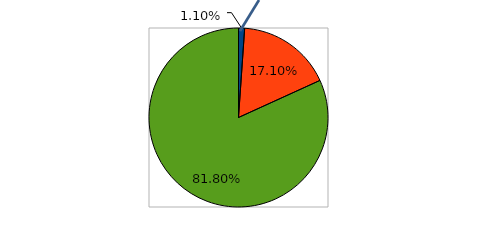
| Category | Series 0 |
|---|---|
| 0 | 0.011 |
| 1 | 0.171 |
| 2 | 0.818 |